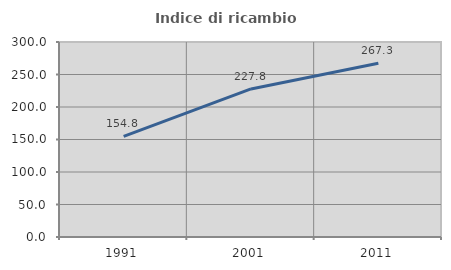
| Category | Indice di ricambio occupazionale  |
|---|---|
| 1991.0 | 154.807 |
| 2001.0 | 227.792 |
| 2011.0 | 267.3 |